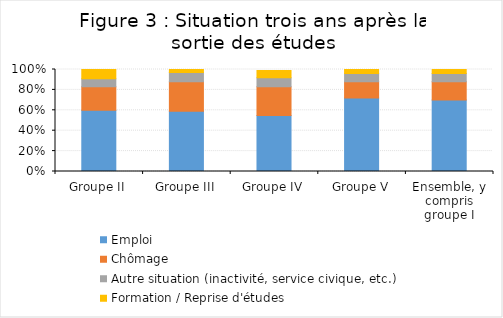
| Category | Emploi | Chômage | Autre situation (inactivité, service civique, etc.) | Formation / Reprise d'études  |
|---|---|---|---|---|
| Groupe II | 0.6 | 0.23 | 0.08 | 0.09 |
| Groupe III | 0.59 | 0.29 | 0.09 | 0.04 |
| Groupe IV | 0.55 | 0.28 | 0.09 | 0.07 |
| Groupe V | 0.72 | 0.16 | 0.08 | 0.04 |
| Ensemble, y compris groupe I | 0.7 | 0.18 | 0.08 | 0.04 |